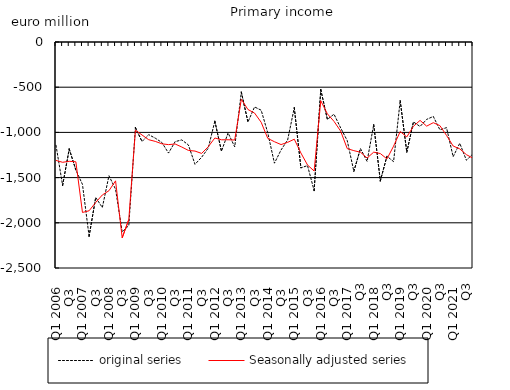
| Category | original series | Seasonally adjusted series |
|---|---|---|
| Q1 2006 | -1142.567 | -1310.132 |
| Q2  | -1586.288 | -1330.735 |
| Q3  | -1183.587 | -1319.614 |
| Q4  | -1415.628 | -1325.127 |
| Q1 2007 | -1575.515 | -1885.592 |
| Q2  | -2149.788 | -1866.762 |
| Q3  | -1719.545 | -1774.965 |
| Q4  | -1831.367 | -1691.993 |
| Q1 2008 | -1479.144 | -1645.196 |
| Q2  | -1629.095 | -1535.717 |
| Q3  | -2100.554 | -2166.336 |
| Q4  | -2030.107 | -1963.414 |
| Q1 2009 | -946.693 | -975.555 |
| Q2  | -1100.966 | -1028.962 |
| Q3  | -1024.674 | -1080.62 |
| Q4  | -1063.791 | -1099.625 |
| Q1 2010 | -1111.861 | -1126.416 |
| Q2  | -1228.71 | -1135.089 |
| Q3  | -1102.297 | -1128.348 |
| Q4  | -1082.926 | -1161.513 |
| Q1 2011 | -1138.638 | -1199.23 |
| Q2  | -1353.064 | -1206.474 |
| Q3  | -1274.971 | -1232.578 |
| Q4  | -1174.286 | -1158.654 |
| Q1 2012 | -875.644 | -1061.842 |
| Q2  | -1208.212 | -1081.921 |
| Q3  | -1005.458 | -1081.379 |
| Q4  | -1159.836 | -1084.342 |
| Q1 2013 | -554.225 | -633.674 |
| Q2  | -884.822 | -746.771 |
| Q3  | -718.295 | -786.193 |
| Q4  | -754.673 | -888.503 |
| Q1 2014 | -1007.162 | -1066.566 |
| Q2  | -1340.549 | -1103.035 |
| Q3  | -1194.53 | -1134.548 |
| Q4  | -1082.753 | -1110.103 |
| Q1 2015 | -726.998 | -1075.384 |
| Q2  | -1392.284 | -1227.765 |
| Q3  | -1367.064 | -1360.608 |
| Q4 | -1644.545 | -1427.371 |
| Q1 2016 | -526.852 | -649.508 |
| Q2  | -855.965 | -794.743 |
| Q3  | -798.489 | -877.891 |
| Q4 | -949.63 | -984.929 |
| Q1 2017 | -1090.501 | -1179.479 |
| Q2  | -1430.968 | -1201.805 |
| Q3 | -1178.513 | -1219.328 |
| Q4 | -1320.553 | -1283.453 |
| Q1 2018 | -914.092 | -1218.478 |
| Q2  | -1536.412 | -1234.012 |
| Q3 | -1263.536 | -1292.961 |
| Q4 | -1323.174 | -1152.494 |
| Q1 2019 | -648.704 | -990.322 |
| Q2  | -1219.122 | -1049.709 |
| Q3 | -884.061 | -932.332 |
| Q4 | -934.587 | -867.343 |
| Q1 2020 | -855.873 | -930.698 |
| Q2  | -823.771 | -892.708 |
| Q3 | -971.448 | -924.799 |
| Q4 | -947.333 | -1033.257 |
| Q1 2021 | -1269.055 | -1150.584 |
| Q2  | -1120.329 | -1182.43 |
| Q3 | -1307.871 | -1245.866 |
| Q4 | -1236.691 | -1285.743 |